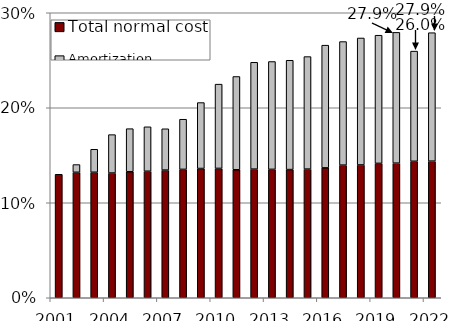
| Category | Total normal cost | Amortization payment |
|---|---|---|
| 2001.0 | 0.13 | 0 |
| 2002.0 | 0.132 | 0.008 |
| 2003.0 | 0.132 | 0.024 |
| 2004.0 | 0.131 | 0.04 |
| 2005.0 | 0.133 | 0.045 |
| 2006.0 | 0.133 | 0.047 |
| 2007.0 | 0.134 | 0.043 |
| 2008.0 | 0.135 | 0.053 |
| 2009.0 | 0.136 | 0.069 |
| 2010.0 | 0.136 | 0.089 |
| 2011.0 | 0.135 | 0.098 |
| 2012.0 | 0.135 | 0.112 |
| 2013.0 | 0.135 | 0.114 |
| 2014.0 | 0.135 | 0.115 |
| 2015.0 | 0.135 | 0.118 |
| 2016.0 | 0.137 | 0.129 |
| 2017.0 | 0.14 | 0.13 |
| 2018.0 | 0.14 | 0.134 |
| 2019.0 | 0.141 | 0.135 |
| 2020.0 | 0.142 | 0.138 |
| 2021.0 | 0.144 | 0.116 |
| 2022.0 | 0.144 | 0.135 |